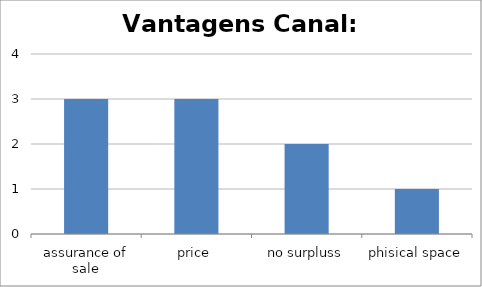
| Category | Series 0 |
|---|---|
| assurance of sale | 3 |
| price | 3 |
| no surpluss | 2 |
| phisical space | 1 |